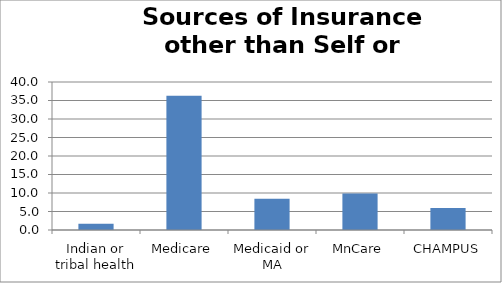
| Category | Series 0 |
|---|---|
| Indian or tribal health | 1.692 |
| Medicare | 36.269 |
| Medicaid or MA | 8.414 |
| MnCare | 9.846 |
| CHAMPUS | 5.974 |